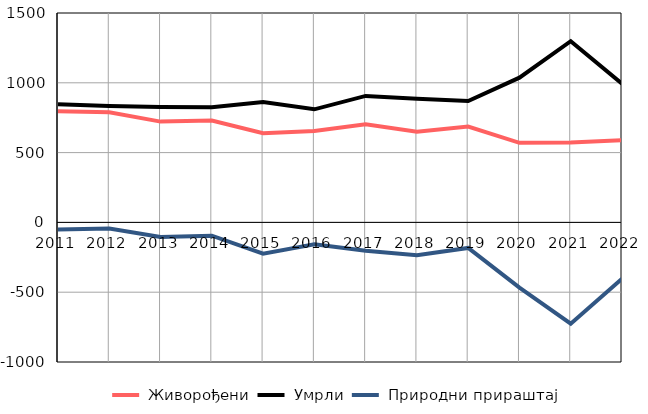
| Category |  Живорођени |  Умрли |  Природни прираштај |
|---|---|---|---|
| 2011.0 | 796 | 846 | -50 |
| 2012.0 | 789 | 833 | -44 |
| 2013.0 | 722 | 826 | -104 |
| 2014.0 | 730 | 825 | -95 |
| 2015.0 | 639 | 863 | -224 |
| 2016.0 | 654 | 810 | -156 |
| 2017.0 | 703 | 906 | -203 |
| 2018.0 | 650 | 886 | -236 |
| 2019.0 | 687 | 870 | -183 |
| 2020.0 | 570 | 1037 | -467 |
| 2021.0 | 572 | 1298 | -726 |
| 2022.0 | 589 | 993 | -404 |